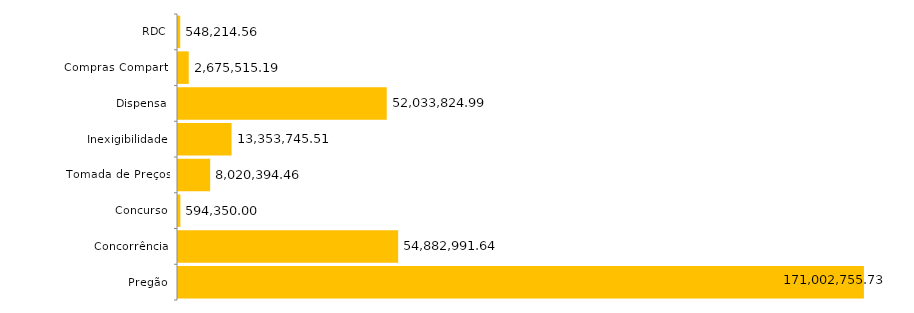
| Category | Series 0 |
|---|---|
| Pregão | 171002755.73 |
| Concorrência | 54882991.64 |
| Concurso | 594350 |
| Tomada de Preços | 8020394.46 |
| Inexigibilidade | 13353745.51 |
| Dispensa | 52033824.99 |
| Compras Compart. | 2675515.19 |
| RDC | 548214.56 |